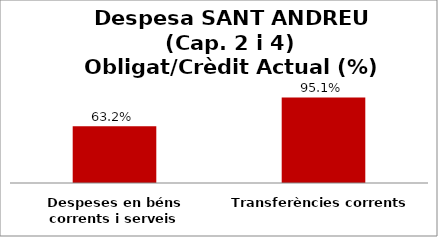
| Category | Series 0 |
|---|---|
| Despeses en béns corrents i serveis | 0.632 |
| Transferències corrents | 0.951 |